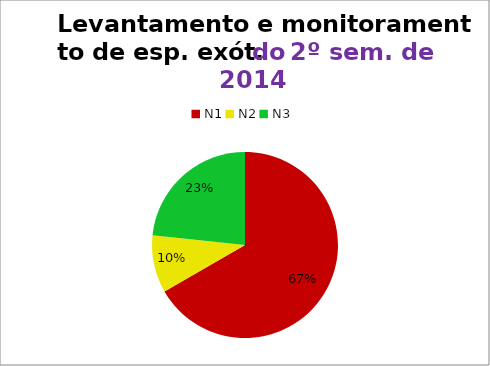
| Category | 2º/14 |
|---|---|
| N1 | 20 |
| N2 | 3 |
| N3 | 7 |